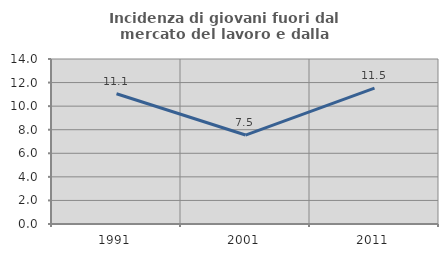
| Category | Incidenza di giovani fuori dal mercato del lavoro e dalla formazione  |
|---|---|
| 1991.0 | 11.051 |
| 2001.0 | 7.547 |
| 2011.0 | 11.526 |